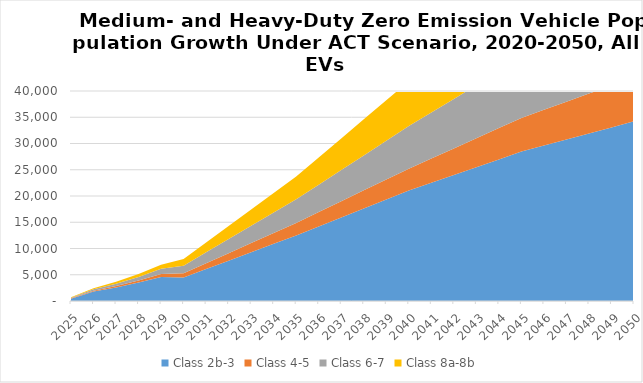
| Category | Class 2b-3 | Class 4-5 | Class 6-7 | Class 8a-8b |
|---|---|---|---|---|
| 2025.0 | 431.366 | 73.928 | 114.891 | 108.631 |
| 2026.0 | 1805.495 | 157.301 | 253.574 | 231.092 |
| 2027.0 | 2591.171 | 256.162 | 428.032 | 375.359 |
| 2028.0 | 3507.893 | 388.218 | 671.948 | 554.822 |
| 2029.0 | 4574.618 | 560.387 | 1004.094 | 779.229 |
| 2030.0 | 4480.434 | 790.883 | 1466.116 | 1248.026 |
| 2031.0 | 6082.271 | 1107.581 | 2073.432 | 1868.212 |
| 2032.0 | 7684.108 | 1424.279 | 2680.749 | 2488.398 |
| 2033.0 | 9285.945 | 1740.978 | 3288.065 | 3108.584 |
| 2034.0 | 10887.782 | 2057.676 | 3895.381 | 3728.771 |
| 2035.0 | 12489.619 | 2374.374 | 4502.697 | 4348.957 |
| 2036.0 | 14196.638 | 2736.706 | 5222.496 | 5188.464 |
| 2037.0 | 15903.657 | 3099.039 | 5942.295 | 6027.971 |
| 2038.0 | 17610.676 | 3461.371 | 6662.094 | 6867.479 |
| 2039.0 | 19317.695 | 3823.703 | 7381.892 | 7706.986 |
| 2040.0 | 21024.714 | 4186.036 | 8101.691 | 8546.493 |
| 2041.0 | 22512.453 | 4628.275 | 8762.779 | 9273.274 |
| 2042.0 | 24000.193 | 5070.514 | 9423.867 | 10000.055 |
| 2043.0 | 25487.932 | 5512.754 | 10084.955 | 10726.836 |
| 2044.0 | 26975.672 | 5954.993 | 10746.043 | 11453.617 |
| 2045.0 | 28463.411 | 6397.232 | 11407.131 | 12180.397 |
| 2046.0 | 29614.591 | 6792.866 | 11920.563 | 12686.926 |
| 2047.0 | 30765.77 | 7188.499 | 12433.995 | 13193.454 |
| 2048.0 | 31916.95 | 7584.133 | 12947.427 | 13699.982 |
| 2049.0 | 33068.13 | 7979.766 | 13460.859 | 14206.51 |
| 2050.0 | 34219.31 | 8375.4 | 13974.291 | 14713.038 |